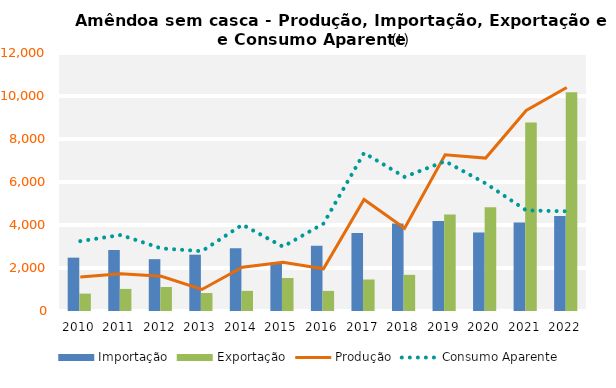
| Category | Importação | Exportação |
|---|---|---|
| 2010.0 | 2481.182 | 809.304 |
| 2011.0 | 2836.006 | 1027.432 |
| 2012.0 | 2410.934 | 1116.44 |
| 2013.0 | 2619.072 | 836.623 |
| 2014.0 | 2918.639 | 937.643 |
| 2015.0 | 2257.581 | 1535.31 |
| 2016.0 | 3040.666 | 935.343 |
| 2017.0 | 3629.881 | 1464.5 |
| 2018.0 | 4065.589 | 1680.447 |
| 2019.0 | 4180.389 | 4483.4 |
| 2020.0 | 3652.401 | 4829.59 |
| 2021.0 | 4121.815 | 8767.489 |
| 2022.0 | 4418.401 | 10179.998 |